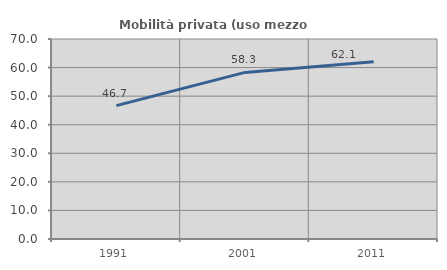
| Category | Mobilità privata (uso mezzo privato) |
|---|---|
| 1991.0 | 46.669 |
| 2001.0 | 58.316 |
| 2011.0 | 62.071 |